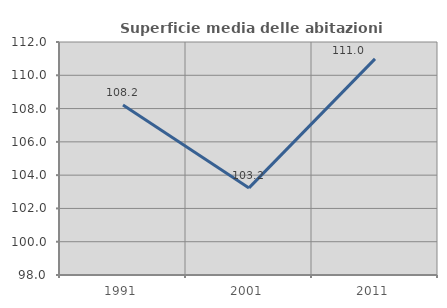
| Category | Superficie media delle abitazioni occupate |
|---|---|
| 1991.0 | 108.21 |
| 2001.0 | 103.233 |
| 2011.0 | 110.986 |